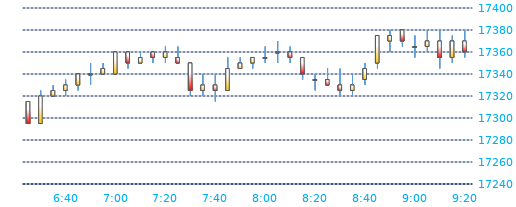
| Category | Series 0 | Series 1 | Series 2 | Series 3 |
|---|---|---|---|---|
| 2016-04-26 09:20:00 | 17370 | 17380 | 17355 | 17360 |
| 2016-04-26 09:15:00 | 17355 | 17375 | 17350 | 17370 |
| 2016-04-26 09:10:00 | 17370 | 17380 | 17345 | 17355 |
| 2016-04-26 09:05:00 | 17365 | 17380 | 17360 | 17370 |
| 2016-04-26 09:00:00 | 17365 | 17375 | 17355 | 17365 |
| 2016-04-26 08:55:00 | 17380 | 17380 | 17365 | 17370 |
| 2016-04-26 08:50:00 | 17370 | 17380 | 17360 | 17375 |
| 2016-04-26 08:45:00 | 17350 | 17375 | 17345 | 17375 |
| 2016-04-26 08:40:00 | 17335 | 17350 | 17330 | 17345 |
| 2016-04-26 08:35:00 | 17325 | 17340 | 17320 | 17330 |
| 2016-04-26 08:30:00 | 17330 | 17345 | 17320 | 17325 |
| 2016-04-26 08:25:00 | 17335 | 17345 | 17330 | 17330 |
| 2016-04-26 08:20:00 | 17335 | 17340 | 17325 | 17335 |
| 2016-04-26 08:15:00 | 17355 | 17355 | 17335 | 17340 |
| 2016-04-26 08:10:00 | 17360 | 17365 | 17350 | 17355 |
| 2016-04-26 08:05:00 | 17360 | 17370 | 17350 | 17360 |
| 2016-04-26 08:00:00 | 17355 | 17365 | 17350 | 17355 |
| 2016-04-26 07:55:00 | 17350 | 17355 | 17345 | 17355 |
| 2016-04-26 07:50:00 | 17345 | 17355 | 17345 | 17350 |
| 2016-04-26 07:45:00 | 17325 | 17355 | 17325 | 17345 |
| 2016-04-26 07:40:00 | 17330 | 17340 | 17315 | 17325 |
| 2016-04-26 07:35:00 | 17325 | 17340 | 17320 | 17330 |
| 2016-04-26 07:30:00 | 17350 | 17350 | 17320 | 17325 |
| 2016-04-26 07:25:00 | 17355 | 17365 | 17350 | 17350 |
| 2016-04-26 07:20:00 | 17355 | 17365 | 17350 | 17360 |
| 2016-04-26 07:15:00 | 17360 | 17360 | 17350 | 17355 |
| 2016-04-26 07:10:00 | 17350 | 17360 | 17350 | 17355 |
| 2016-04-26 07:05:00 | 17360 | 17360 | 17345 | 17350 |
| 2016-04-26 07:00:00 | 17340 | 17360 | 17340 | 17360 |
| 2016-04-26 06:55:00 | 17340 | 17350 | 17340 | 17345 |
| 2016-04-26 06:50:00 | 17340 | 17350 | 17330 | 17340 |
| 2016-04-26 06:45:00 | 17330 | 17340 | 17325 | 17340 |
| 2016-04-26 06:40:00 | 17325 | 17335 | 17320 | 17330 |
| 2016-04-26 06:35:00 | 17320 | 17330 | 17320 | 17325 |
| 2016-04-26 06:30:00 | 17295 | 17325 | 17295 | 17320 |
| 2016-04-26 06:25:00 | 17315 | 17315 | 17295 | 17295 |